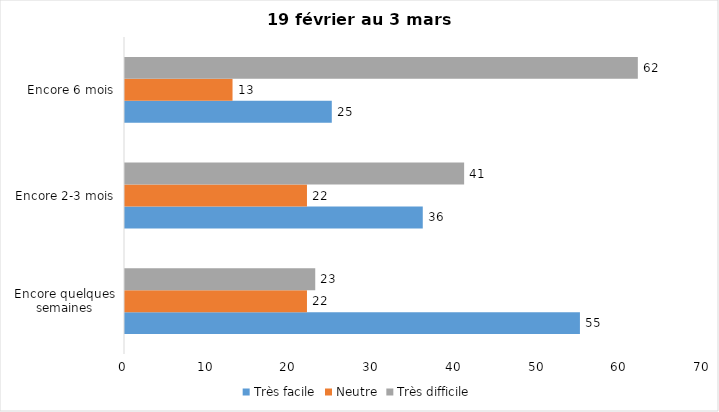
| Category | Très facile | Neutre | Très difficile |
|---|---|---|---|
| Encore quelques semaines | 55 | 22 | 23 |
| Encore 2-3 mois | 36 | 22 | 41 |
| Encore 6 mois | 25 | 13 | 62 |